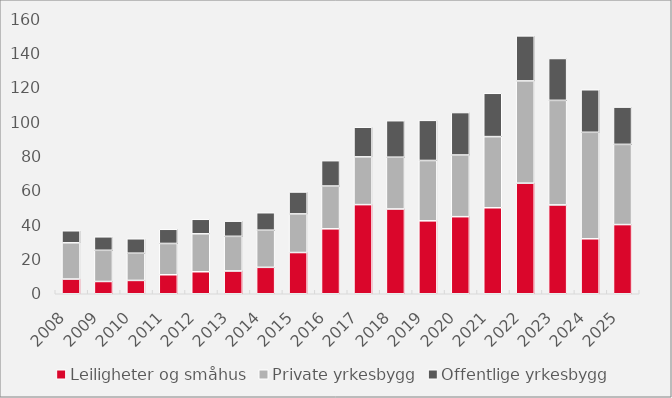
| Category | Leiligheter og småhus | Private yrkesbygg | Offentlige yrkesbygg |
|---|---|---|---|
| 2008.0 | 8.563 | 21.079 | 7.008 |
| 2009.0 | 7.138 | 18.149 | 7.85 |
| 2010.0 | 7.761 | 15.839 | 8.387 |
| 2011.0 | 11.052 | 18.211 | 8.237 |
| 2012.0 | 12.809 | 22.07 | 8.442 |
| 2013.0 | 13.25 | 20.163 | 8.823 |
| 2014.0 | 15.367 | 21.62 | 10.153 |
| 2015.0 | 23.985 | 22.475 | 12.745 |
| 2016.0 | 37.79 | 24.888 | 14.75 |
| 2017.0 | 51.858 | 27.79 | 17.238 |
| 2018.0 | 49.327 | 30.125 | 21.237 |
| 2019.0 | 42.43 | 35.111 | 23.343 |
| 2020.0 | 44.844 | 35.891 | 24.69 |
| 2021.0 | 50.034 | 41.391 | 25.204 |
| 2022.0 | 64.341 | 59.502 | 26.187 |
| 2023.0 | 51.694 | 60.826 | 24.362 |
| 2024.0 | 31.99 | 61.952 | 24.742 |
| 2025.0 | 40.246 | 46.669 | 21.691 |